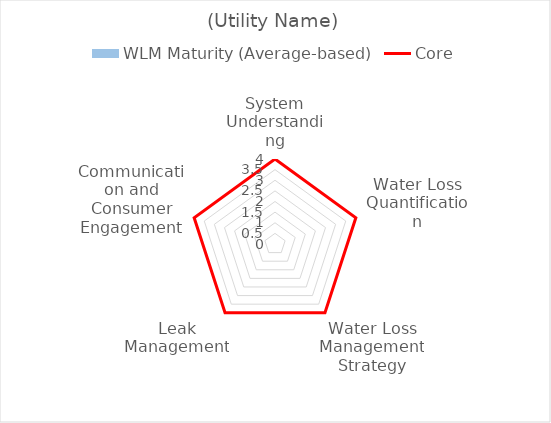
| Category | WLM Maturity (Average-based) |
|---|---|
| System Understanding | 0 |
| Water Loss Quantification | 0 |
| Water Loss Management Strategy | 0 |
| Leak Management | 0 |
| Communication and Consumer Engagement | 0 |